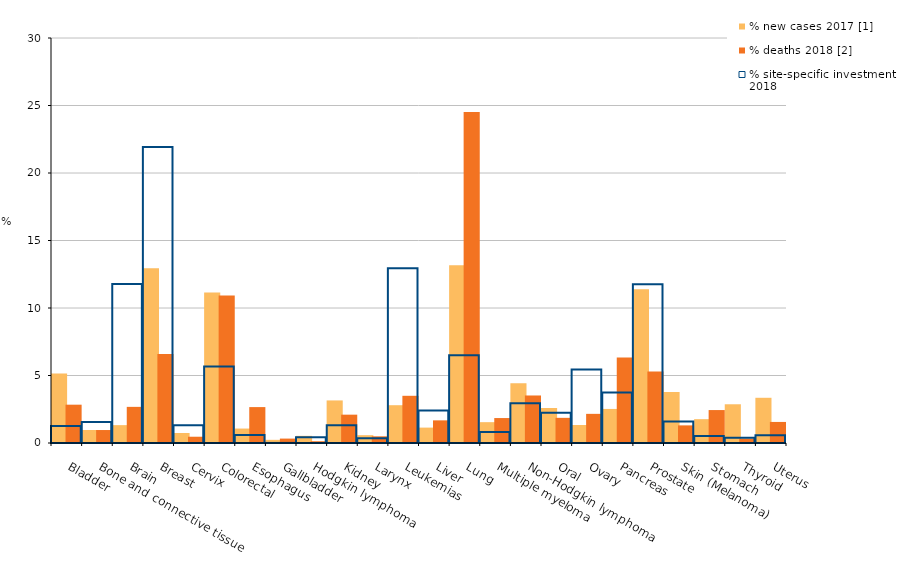
| Category | % new cases 2017 [1] | % deaths 2018 [2] |
|---|---|---|
| Bladder | 5.146 | 2.838 |
| Bone and connective tissue | 0.964 | 0.961 |
| Brain | 1.323 | 2.677 |
| Breast | 12.952 | 6.59 |
| Cervix | 0.739 | 0.465 |
| Colorectal | 11.14 | 10.927 |
| Esophagus | 1.07 | 2.66 |
| Gallbladder | 0.235 | 0.327 |
| Hodgkin lymphoma | 0.53 | 0.132 |
| Kidney | 3.153 | 2.099 |
| Larynx | 0.579 | 0.496 |
| Leukemias | 2.799 | 3.496 |
| Liver | 1.14 | 1.677 |
| Lung | 13.159 | 24.517 |
| Multiple myeloma | 1.543 | 1.848 |
| Non-Hodgkin lymphoma | 4.433 | 3.52 |
| Oral | 2.593 | 1.864 |
| Ovary | 1.334 | 2.159 |
| Pancreas | 2.523 | 6.326 |
| Prostate | 11.383 | 5.305 |
| Skin (Melanoma) | 3.787 | 1.305 |
| Stomach | 1.765 | 2.44 |
| Thyroid | 2.869 | 0.321 |
| Uterus | 3.35 | 1.56 |